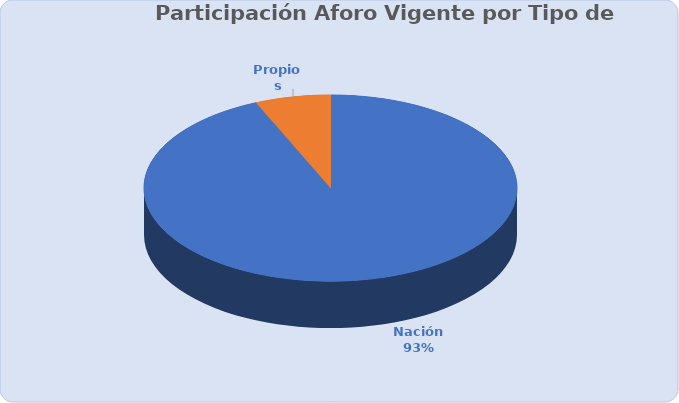
| Category | Total |
|---|---|
| Nación | 2725951.911 |
| Propios | 190805.665 |